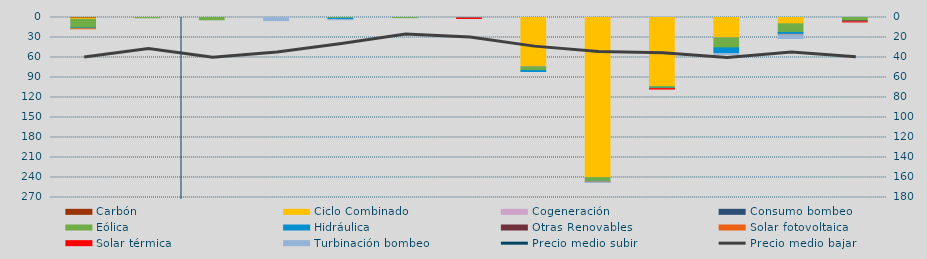
| Category | Carbón | Ciclo Combinado | Cogeneración | Consumo bombeo | Eólica | Hidráulica | Otras Renovables | Solar fotovoltaica | Solar térmica | Turbinación bombeo |
|---|---|---|---|---|---|---|---|---|---|---|
| 0 | 846 | 1898.8 | 0 |  | 12932.4 | 1173 | 80 | 33 | 0 | 0 |
| 1 | 0 | 0 | 0 |  | 464.6 | 0 | 0 | 0 | 0 | 0 |
| 2 | 0 | 0 | 0 |  | 3444.7 | 0 | 0 | 0 | 0 | 0 |
| 3 | 0 | 0 | 0 |  | 0 | 0 | 0 | 0 | 0 | 4657.9 |
| 4 | 0 | 0 | 0 |  | 1293.6 | 1910.2 | 0 | 0 | 0 | 100 |
| 5 | 0 | 0 | 0 |  | 227.5 | 0 | 0 | 0 | 0 | 0 |
| 6 | 0 | 0 | 0 |  | 0 | 946.5 | 0 | 61.6 | 516 | 0 |
| 7 | 0 | 73835.8 | 271.4 |  | 5567.4 | 2850.8 | 0 | 0 | 0 | 0 |
| 8 | 0 | 239981.7 | 135.5 |  | 5593.5 | 740.7 | 0 | 320.4 | 0 | 640 |
| 9 | 0 | 103567.5 | 0 |  | 2385.4 | 710 | 0 | 170.6 | 366.5 | 0 |
| 10 | 0 | 30277.5 | 252.2 |  | 15007.3 | 8686.8 | 0 | 0 | 0 | 1087 |
| 11 | 0 | 9485.3 | 0 |  | 12915.2 | 2939 | 429 | 195.7 | 0 | 5519 |
| 12 | 0 | 0 | 0 |  | 4917.9 | 180 | 1584 | 0 | 30 | 0 |